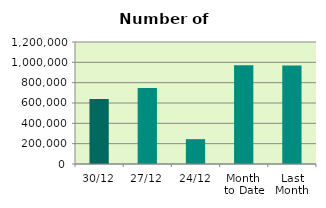
| Category | Series 0 |
|---|---|
| 30/12 | 638372 |
| 27/12 | 748710 |
| 24/12 | 244394 |
| Month 
to Date | 972186 |
| Last
Month | 969317.238 |